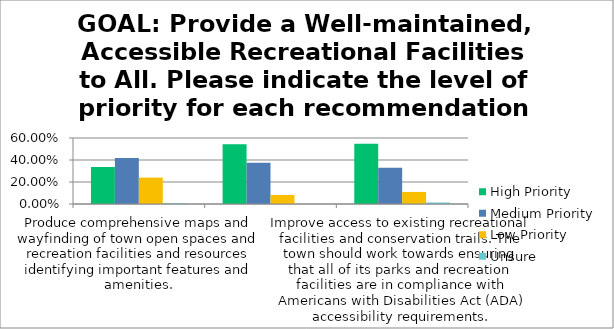
| Category | High Priority | Medium Priority | Low Priority | Unsure |
|---|---|---|---|---|
| Produce comprehensive maps and wayfinding of town open spaces and recreation facilities and resources identifying important features and amenities. | 0.336 | 0.418 | 0.24 | 0.007 |
| Implement management strategies for upkeep, maintenance and enhanced access of/to all recreational resources. | 0.544 | 0.374 | 0.082 | 0 |
| Improve access to existing recreational facilities and conservation trails. The town should work towards ensuring that all of its parks and recreation facilities are in compliance with Americans with Disabilities Act (ADA) accessibility requirements. | 0.548 | 0.329 | 0.11 | 0.014 |